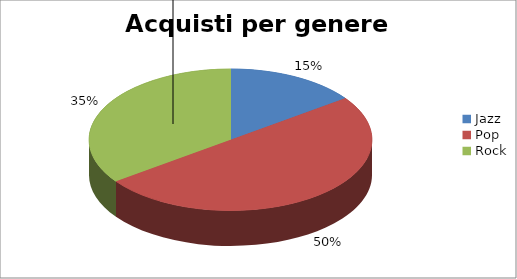
| Category | gennaio |
|---|---|
| Jazz | 15 |
| Pop | 50 |
| Rock | 35 |